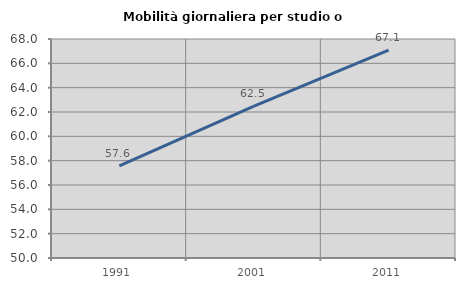
| Category | Mobilità giornaliera per studio o lavoro |
|---|---|
| 1991.0 | 57.563 |
| 2001.0 | 62.492 |
| 2011.0 | 67.081 |